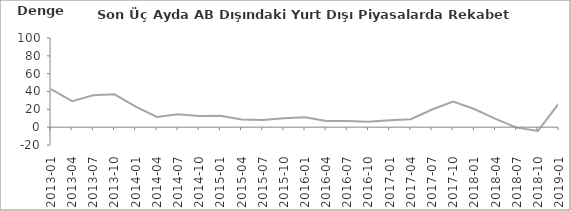
| Category | Son Üç Aydaki AB Dışındaki Piyasalarda Rekabet Gücü |
|---|---|
| 2013-01 | 42.7 |
| 2013-04 | 29.1 |
| 2013-07 | 35.8 |
| 2013-10 | 36.9 |
| 2014-01 | 23 |
| 2014-04 | 11.4 |
| 2014-07 | 14.6 |
| 2014-10 | 12.4 |
| 2015-01 | 12.9 |
| 2015-04 | 8.6 |
| 2015-07 | 8.1 |
| 2015-10 | 9.9 |
| 2016-01 | 11 |
| 2016-04 | 7 |
| 2016-07 | 6.9 |
| 2016-10 | 6 |
| 2017-01 | 7.8 |
| 2017-04 | 9 |
| 2017-07 | 19.8 |
| 2017-10 | 28.8 |
| 2018-01 | 20.4 |
| 2018-04 | 9.3 |
| 2018-07 | -0.5 |
| 2018-10 | -4.3 |
| 2019-01 | 26.9 |